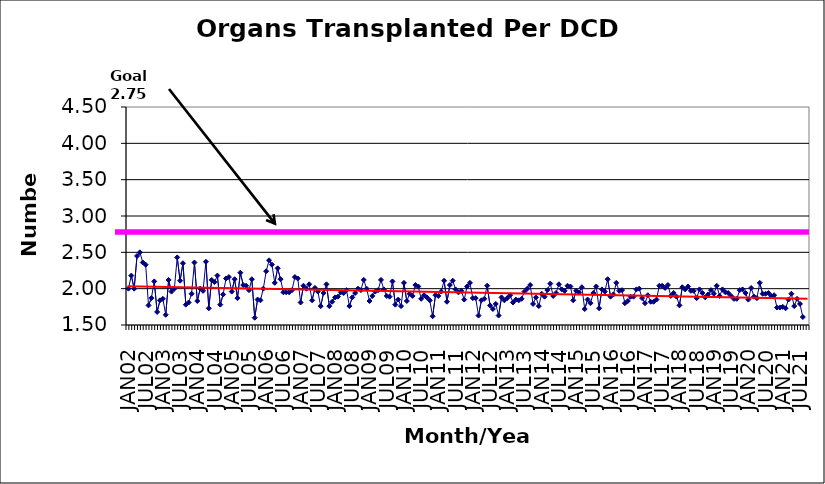
| Category | Series 0 |
|---|---|
| JAN02 | 2 |
| FEB02 | 2.18 |
| MAR02 | 2 |
| APR02 | 2.45 |
| MAY02 | 2.5 |
| JUN02 | 2.36 |
| JUL02 | 2.33 |
| AUG02 | 1.77 |
| SEP02 | 1.87 |
| OCT02 | 2.1 |
| NOV02 | 1.68 |
| DEC02 | 1.84 |
| JAN03 | 1.86 |
| FEB03 | 1.64 |
| MAR03 | 2.12 |
| APR03 | 1.96 |
| MAY03 | 2 |
| JUN03 | 2.43 |
| JUL03 | 2.11 |
| AUG03 | 2.35 |
| SEP03 | 1.78 |
| OCT03 | 1.81 |
| NOV03 | 1.93 |
| DEC03 | 2.36 |
| JAN04 | 1.83 |
| FEB04 | 2 |
| MAR04 | 1.97 |
| APR04 | 2.37 |
| MAY04 | 1.73 |
| JUN04 | 2.12 |
| JUL04 | 2.09 |
| AUG04 | 2.18 |
| SEP04 | 1.78 |
| OCT04 | 1.92 |
| NOV04 | 2.14 |
| DEC04 | 2.16 |
| JAN05 | 1.96 |
| FEB05 | 2.13 |
| MAR05 | 1.87 |
| APR05 | 2.22 |
| MAY05 | 2.05 |
| JUN05 | 2.04 |
| JUL05 | 1.98 |
| AUG05 | 2.13 |
| SEP05 | 1.6 |
| OCT05 | 1.85 |
| NOV05 | 1.84 |
| DEC05 | 2 |
| JAN06 | 2.24 |
| FEB06 | 2.39 |
| MAR06 | 2.33 |
| APR06 | 2.08 |
| MAY06 | 2.28 |
| JUN06 | 2.13 |
| JUL06 | 1.95 |
| AUG06 | 1.95 |
| SEP06 | 1.95 |
| OCT06 | 1.98 |
| NOV06 | 2.16 |
| DEC06 | 2.14 |
| JAN07 | 1.81 |
| FEB07 | 2.04 |
| MAR07 | 2 |
| APR07 | 2.06 |
| MAY07 | 1.84 |
| JUN07 | 2.01 |
| JUL07 | 1.96 |
| AUG07 | 1.76 |
| SEP07 | 1.94 |
| OCT07 | 2.06 |
| NOV07 | 1.76 |
| DEC07 | 1.82 |
| JAN08 | 1.88 |
| FEB08 | 1.89 |
| MAR08 | 1.95 |
| APR08 | 1.94 |
| MAY08 | 1.98 |
| JUN08 | 1.76 |
| JUL08 | 1.88 |
| AUG08 | 1.94 |
| SEP08 | 2 |
| OCT08 | 1.98 |
| NOV08 | 2.12 |
| DEC08 | 2 |
| JAN09 | 1.83 |
| FEB09 | 1.9 |
| MAR09 | 1.96 |
| APR09 | 1.98 |
| MAY09 | 2.12 |
| JUN09 | 1.99 |
| JUL09 | 1.9 |
| AUG09 | 1.89 |
| SEP09 | 2.1 |
| OCT09 | 1.78 |
| NOV09 | 1.85 |
| DEC09 | 1.76 |
| JAN10 | 2.08 |
| FEB10 | 1.83 |
| MAR10 | 1.93 |
| APR10 | 1.9 |
| MAY10 | 2.05 |
| JUN10 | 2.03 |
| JUL10 | 1.86 |
| AUG10 | 1.91 |
| SEP10 | 1.88 |
| OCT10 | 1.84 |
| NOV10 | 1.62 |
| DEC10 | 1.91 |
| JAN11 | 1.9 |
| FEB11 | 1.96 |
| MAR11 | 2.11 |
| APR11 | 1.82 |
| MAY11 | 2.05 |
| JUN11 | 2.11 |
| JUL11 | 1.99 |
| AUG11 | 1.95 |
| SEP11 | 1.97 |
| OCT11 | 1.85 |
| NOV11 | 2.03 |
| DEC11 | 2.08 |
| JAN12 | 1.87 |
| FEB12 | 1.87 |
| MAR12 | 1.63 |
| APR12 | 1.84 |
| MAY12 | 1.86 |
| JUN12 | 2.04 |
| JUL12 | 1.77 |
| AUG12 | 1.72 |
| SEP12 | 1.79 |
| OCT12 | 1.63 |
| NOV12 | 1.88 |
| DEC12 | 1.84 |
| JAN13 | 1.87 |
| FEB13 | 1.91 |
| MAR13 | 1.81 |
| APR13 | 1.85 |
| MAY13 | 1.84 |
| JUN13 | 1.86 |
| JUL13 | 1.96 |
| AUG13 | 2 |
| SEP13 | 2.05 |
| OCT13 | 1.79 |
| NOV13 | 1.88 |
| DEC13 | 1.76 |
| JAN14 | 1.93 |
| FEB14 | 1.89 |
| MAR14 | 1.98 |
| APR14 | 2.07 |
| MAY14 | 1.9 |
| JUN14 | 1.94 |
| JUL14 | 2.06 |
| AUG14 | 1.99 |
| SEP14 | 1.97 |
| OCT14 | 2.04 |
| NOV14 | 2.03 |
| DEC14 | 1.84 |
| JAN15 | 1.97 |
| FEB15 | 1.95 |
| MAR15 | 2.02 |
| APR15 | 1.72 |
| MAY15 | 1.85 |
| JUN15 | 1.8 |
| JUL15 | 1.94 |
| AUG15 | 2.03 |
| SEP15 | 1.73 |
| OCT15 | 1.99 |
| NOV15 | 1.96 |
| DEC15 | 2.13 |
| JAN16 | 1.89 |
| FEB16 | 1.92 |
| MAR16 | 2.08 |
| APR16 | 1.97 |
| MAY16 | 1.98 |
| JUN16 | 1.8 |
| JUL16 | 1.83 |
| AUG16 | 1.89 |
| SEP16 | 1.89 |
| OCT16 | 1.99 |
| NOV16 | 2 |
| DEC16 | 1.87 |
| JAN17 | 1.8 |
| FEB17 | 1.91 |
| MAR17 | 1.82 |
| APR17 | 1.82 |
| MAY17 | 1.85 |
| JUN17 | 2.04 |
| JUL17 | 2.04 |
| AUG17 | 2.01 |
| SEP17 | 2.05 |
| OCT17 | 1.9 |
| NOV17 | 1.94 |
| DEC17 | 1.89 |
| JAN18 | 1.77 |
| FEB18 | 2.02 |
| MAR18 | 1.99 |
| APR18 | 2.03 |
| MAY18 | 1.97 |
| JUN18 | 1.97 |
| JUL18 | 1.87 |
| AUG18 | 1.99 |
| SEP18 | 1.94 |
| OCT18 | 1.88 |
| NOV18 | 1.92 |
| DEC18 | 1.98 |
| JAN19 | 1.93 |
| FEB19 | 2.04 |
| MAR19 | 1.9 |
| APR19 | 1.99 |
| MAY19 | 1.95 |
| JUN19 | 1.94 |
| JUL19 | 1.9 |
| AUG19 | 1.86 |
| SEP19 | 1.86 |
| OCT19 | 1.98 |
| NOV19 | 1.99 |
| DEC19 | 1.94 |
| JAN20 | 1.85 |
| FEB20 | 2.01 |
| MAR20 | 1.89 |
| APR20 | 1.87 |
| MAY20 | 2.08 |
| JUN20 | 1.93 |
| JUL20 | 1.93 |
| AUG20 | 1.94 |
| SEP20 | 1.9 |
| OCT20 | 1.91 |
| NOV20 | 1.74 |
| DEC20 | 1.74 |
| JAN21 | 1.75 |
| FEB21 | 1.73 |
| MAR21 | 1.85 |
| APR21 | 1.93 |
| MAY21 | 1.76 |
| JUN21 | 1.86 |
| JUL21 | 1.79 |
| AUG21 | 1.61 |